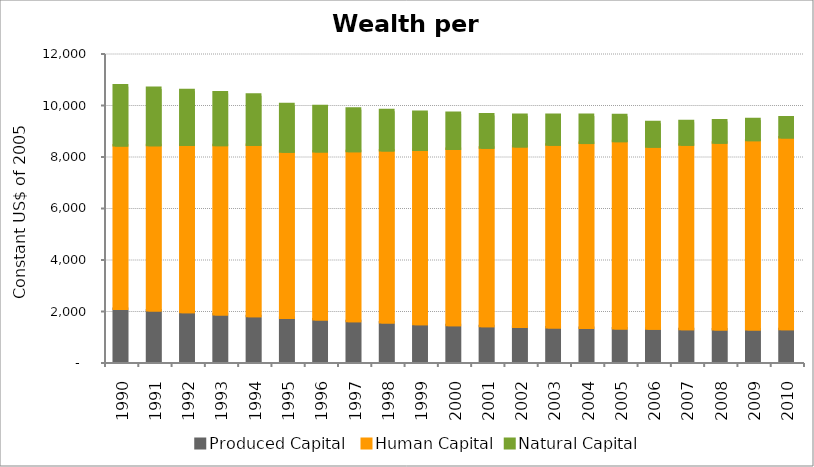
| Category | Produced Capital  | Human Capital | Natural Capital |
|---|---|---|---|
| 1990.0 | 2058.158 | 6345.225 | 2330.521 |
| 1991.0 | 1998.261 | 6416.649 | 2222.82 |
| 1992.0 | 1935.124 | 6493.937 | 2124.16 |
| 1993.0 | 1845.143 | 6575.741 | 2044.423 |
| 1994.0 | 1773.392 | 6658.027 | 1947.644 |
| 1995.0 | 1712.303 | 6451.204 | 1846.566 |
| 1996.0 | 1649.682 | 6525.795 | 1754.813 |
| 1997.0 | 1579.768 | 6604.232 | 1655.389 |
| 1998.0 | 1530.566 | 6684.351 | 1562.695 |
| 1999.0 | 1467.469 | 6766.045 | 1478.978 |
| 2000.0 | 1425.011 | 6850.267 | 1391.628 |
| 2001.0 | 1388.556 | 6928.492 | 1295.717 |
| 2002.0 | 1359.672 | 7010.386 | 1225.606 |
| 2003.0 | 1338.004 | 7096.11 | 1154.602 |
| 2004.0 | 1316.705 | 7185.12 | 1087.373 |
| 2005.0 | 1300.218 | 7276.203 | 1004.466 |
| 2006.0 | 1290.191 | 7071.89 | 948.476 |
| 2007.0 | 1271.278 | 7161.711 | 913.088 |
| 2008.0 | 1259.691 | 7255.714 | 863.705 |
| 2009.0 | 1261.753 | 7351.861 | 817.749 |
| 2010.0 | 1269.747 | 7448.609 | 774.518 |